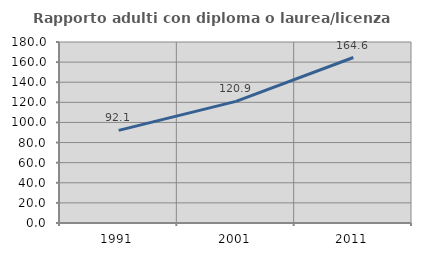
| Category | Rapporto adulti con diploma o laurea/licenza media  |
|---|---|
| 1991.0 | 92.085 |
| 2001.0 | 120.923 |
| 2011.0 | 164.56 |